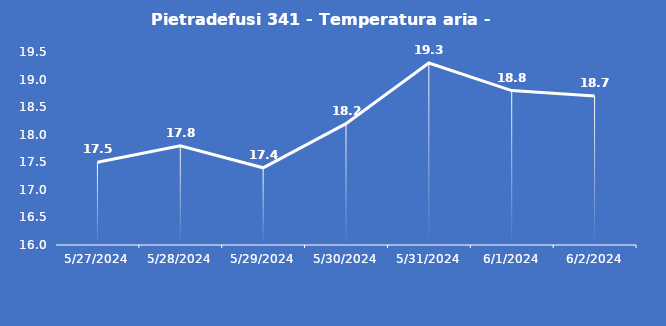
| Category | Pietradefusi 341 - Temperatura aria - Grezzo (°C) |
|---|---|
| 5/27/24 | 17.5 |
| 5/28/24 | 17.8 |
| 5/29/24 | 17.4 |
| 5/30/24 | 18.2 |
| 5/31/24 | 19.3 |
| 6/1/24 | 18.8 |
| 6/2/24 | 18.7 |